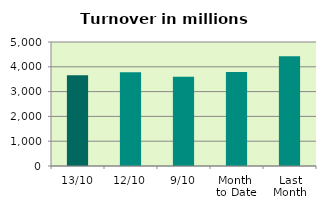
| Category | Series 0 |
|---|---|
| 13/10 | 3661.235 |
| 12/10 | 3776.302 |
| 9/10 | 3594.936 |
| Month 
to Date | 3787.169 |
| Last
Month | 4425.778 |